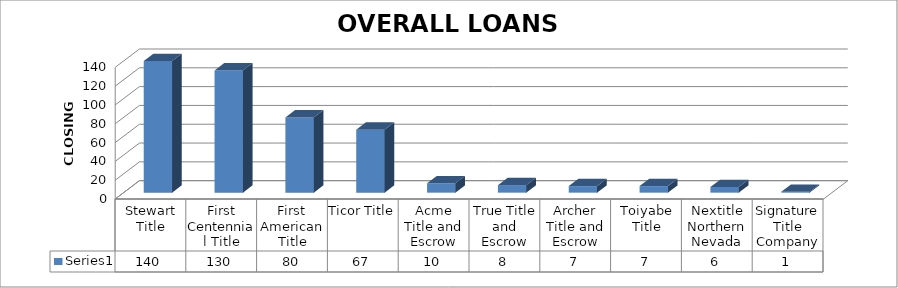
| Category | Series 0 |
|---|---|
| Stewart Title | 140 |
| First Centennial Title | 130 |
| First American Title | 80 |
| Ticor Title | 67 |
| Acme Title and Escrow | 10 |
| True Title and Escrow | 8 |
| Archer Title and Escrow | 7 |
| Toiyabe Title | 7 |
| Nextitle Northern Nevada | 6 |
| Signature Title Company | 1 |